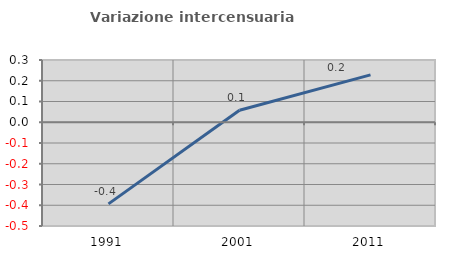
| Category | Variazione intercensuaria annua |
|---|---|
| 1991.0 | -0.393 |
| 2001.0 | 0.058 |
| 2011.0 | 0.229 |